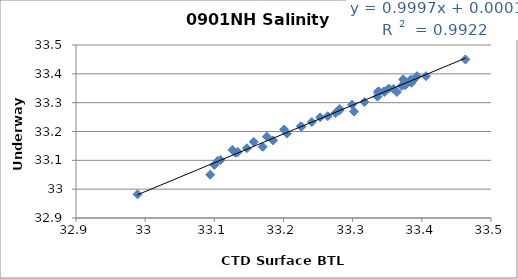
| Category | Sal |
|---|---|
| 33.371 | 33.358 |
| 33.317 | 33.302 |
| 33.385 | 33.379 |
| 33.393 | 33.392 |
| 33.359 | 33.348 |
| 33.364 | 33.337 |
| 33.337 | 33.339 |
| 33.345 | 33.339 |
| 33.337 | 33.338 |
| 33.275 | 33.264 |
| 33.253 | 33.249 |
| 33.134 | 33.129 |
| 33.299 | 33.293 |
| 33.281 | 33.278 |
| 33.264 | 33.253 |
| 33.281 | 33.273 |
| 33.338 | 33.338 |
| 33.373 | 33.381 |
| 33.352 | 33.349 |
| 33.376 | 33.372 |
| 33.302 | 33.269 |
| 33.336 | 33.321 |
| 33.375 | 33.361 |
| 33.346 | 33.337 |
| 33.337 | 33.333 |
| 33.185 | 33.169 |
| 33.17 | 33.147 |
| 33.147 | 33.142 |
| 33.201 | 33.207 |
| 33.205 | 33.193 |
| 33.241 | 33.233 |
| 33.131 | 33.126 |
| 33.157 | 33.164 |
| 33.225 | 33.218 |
| 33.388 | 33.379 |
| 33.463 | 33.45 |
| 33.383 | 33.378 |
| 33.384 | 33.378 |
| 33.379 | 33.368 |
| 33.381 | 33.373 |
| 33.105 | 33.098 |
| 32.989 | 32.982 |
| 33.1 | 33.084 |
| 33.176 | 33.182 |
| 33.109 | 33.101 |
| 33.226 | 33.217 |
| 33.126 | 33.136 |
| 33.094 | 33.05 |
| 33.385 | 33.369 |
| 33.376 | 33.361 |
| 33.406 | 33.392 |